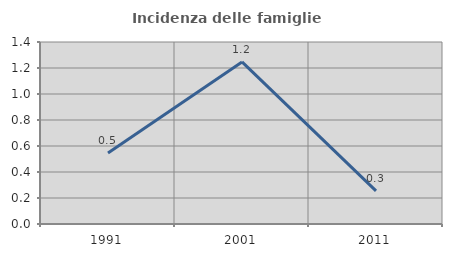
| Category | Incidenza delle famiglie numerose |
|---|---|
| 1991.0 | 0.546 |
| 2001.0 | 1.247 |
| 2011.0 | 0.255 |